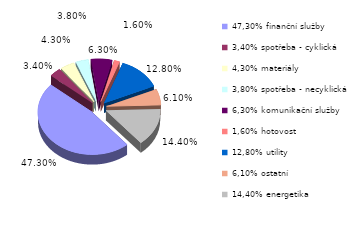
| Category | Series 0 |
|---|---|
| 47,30% finanční služby | 0.473 |
| 3,40% spotřeba - cyklická | 0.034 |
| 4,30% materiály | 0.043 |
| 3,80% spotřeba - necyklická | 0.038 |
| 6,30% komunikační služby | 0.063 |
| 1,60% hotovost | 0.016 |
| 12,80% utility | 0.128 |
| 6,10% ostatní | 0.061 |
| 14,40% energetika | 0.144 |